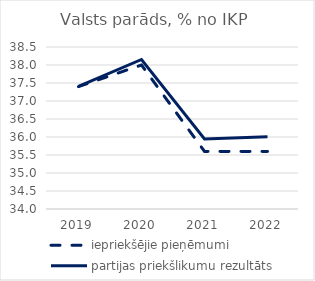
| Category | iepriekšējie pieņēmumi | partijas priekšlikumu rezultāts |
|---|---|---|
| 2019.0 | 37.4 | 37.405 |
| 2020.0 | 38 | 38.153 |
| 2021.0 | 35.6 | 35.944 |
| 2022.0 | 35.6 | 36.005 |